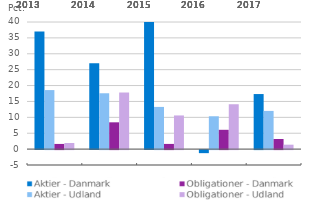
| Category | Aktier - Danmark | Aktier - Udland | Obligationer - Danmark | Obligationer - Udland |
|---|---|---|---|---|
| 2013 | 37.011 | 18.573 | 1.629 | 1.928 |
| 2014 | 27.022 | 17.574 | 8.432 | 17.812 |
| 2015 | 40.187 | 13.281 | 1.633 | 10.593 |
| 2016 | -0.955 | 10.335 | 6.075 | 14.117 |
| 2017 | 17.325 | 12.018 | 3.19 | 1.392 |